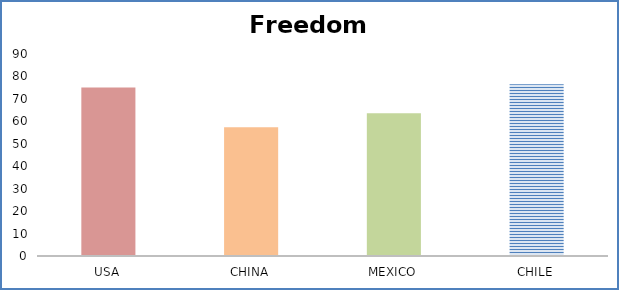
| Category | Freedom Index |
|---|---|
| USA | 75.1 |
| CHINA | 57.4 |
| MEXICO | 63.6 |
| CHILE | 76.5 |